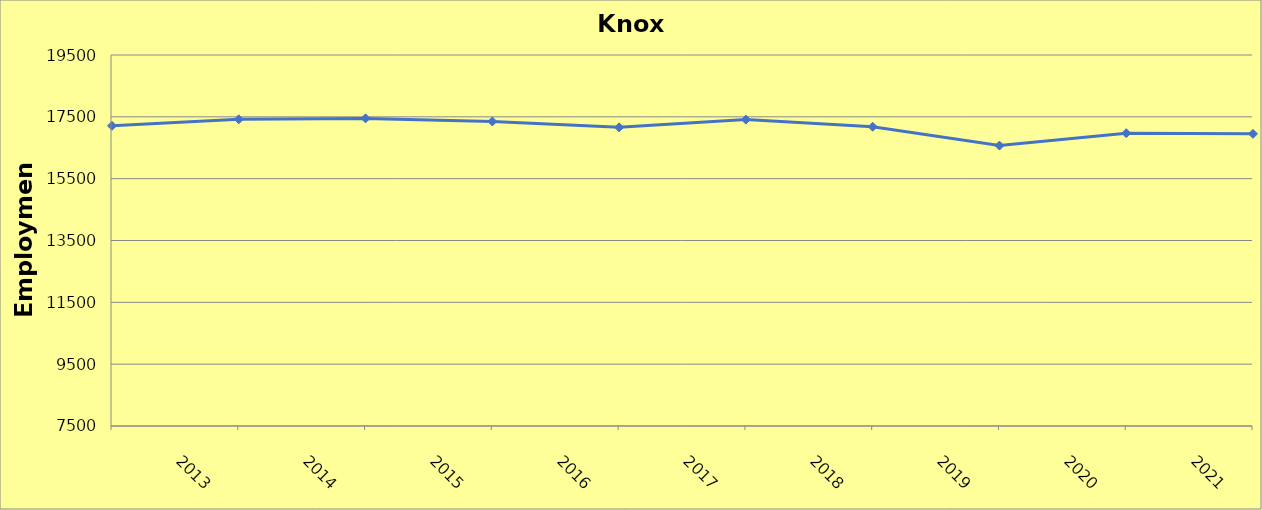
| Category | Knox County |
|---|---|
| 2013.0 | 17210 |
| 2014.0 | 17420 |
| 2015.0 | 17450 |
| 2016.0 | 17350 |
| 2017.0 | 17160 |
| 2018.0 | 17410 |
| 2019.0 | 17180 |
| 2020.0 | 16570 |
| 2021.0 | 16970 |
| 2022.0 | 16950 |